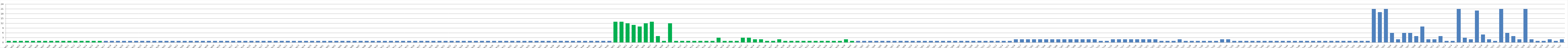
| Category | Series 0 |
|---|---|
| AW01 | 1 |
| AW02 | 1 |
| AW03 | 1 |
| AW04 | 1 |
| AW05 | 1 |
| AW06 | 1 |
| AW07 | 1 |
| AW08 | 1 |
| AW09 | 1 |
| AW10 | 1 |
| AW11 | 1 |
| AW12 | 1 |
| AW13 | 1 |
| AW14 | 1 |
| AW15 | 1 |
| AW16 | 1 |
| AW17 | 1 |
| AW18 | 1 |
| AW19 | 1 |
| AW20 | 1 |
| AW21 | 1 |
| AW22 | 1 |
| AW23 | 1 |
| AW24 | 1 |
| AW25 | 1 |
| AW26 | 1 |
| BW01 | 1 |
| BW02 | 1 |
| BW03 | 1 |
| BWO4 | 1 |
| BW05 | 1 |
| BW06 | 1 |
| BW07 | 1 |
| BW08 | 1 |
| BW09 | 1 |
| BW10 | 1 |
| BW11 | 1 |
| BW12 | 1 |
| BW13 | 1 |
| BW14 | 1 |
| BW15 | 1 |
| BW16 | 1 |
| BW17 | 1 |
| BW18 | 1 |
| BW19 | 1 |
| BW20 | 1 |
| BW21 | 1 |
| BW22 | 1 |
| BW23 | 1 |
| BW24 | 1 |
| BW25 | 1 |
| BW26 | 1 |
| CW01 | 1 |
| CW02 | 1 |
| CW03 | 1 |
| CW04 | 1 |
| CW05 | 1 |
| CW06 | 1 |
| CW07 | 1 |
| CW08 | 1 |
| CW09 | 1 |
| CW10 | 1 |
| CW11 | 1 |
| CW12 | 1 |
| CW13 | 1 |
| CW14 | 1 |
| CW15 | 1 |
| CW16 | 1 |
| CW17 | 1 |
| CW18 | 1 |
| CW19 | 1 |
| CW20 | 1 |
| CW21 | 1 |
| CW22 | 1 |
| CW23 | 1 |
| CW24 | 1 |
| CW25 | 1 |
| CW26 | 1 |
| CW27 | 1 |
| CW28 | 1 |
| CW29 | 1 |
| CW30 | 1 |
| CW31 | 1 |
| CW32 | 1 |
| CW33 | 1 |
| CW34 | 1 |
| CW35 | 1 |
| CW36 | 1 |
| CW37 | 1 |
| CW38 | 1 |
| CW39 | 1 |
| CW40 | 1 |
| CW41 | 1 |
| CW42 | 1 |
| CW43 | 1 |
| CW44 | 1 |
| CW45 | 1 |
| CW46 | 1 |
| CW47 | 1 |
| CW48 | 1 |
| DW01 | 13 |
| DW02 | 13 |
| DW03 | 12 |
| DW04 | 11 |
| DW05 | 10 |
| DW06 | 12 |
| DW07 | 13 |
| DW08 | 4 |
| DW09 | 1 |
| DW10 | 12 |
| DW11 | 1 |
| DW12 | 1 |
| DW13 | 1 |
| DW14 | 1 |
| DW15 | 1 |
| DW16 | 1 |
| DW17 | 1 |
| DW18 | 3 |
| DW19 | 1 |
| DW20 | 1 |
| DW21 | 1 |
| DW22 | 3 |
| DW23 | 3 |
| DW24 | 2 |
| DW25 | 2 |
| DW26 | 1 |
| DW27 | 1 |
| DW28 | 2 |
| DW29 | 1 |
| DW30 | 1 |
| DW31 | 1 |
| DW32 | 1 |
| DW33 | 1 |
| DW34 | 1 |
| DW35 | 1 |
| DW36 | 1 |
| DW37 | 1 |
| DW38 | 1 |
| DW39 | 2 |
| DW40 | 1 |
| AU01 | 1 |
| AU02 | 1 |
| AU03 | 1 |
| AU04 | 1 |
| AU05 | 1 |
| AU06 | 1 |
| AU07 | 1 |
| AU08 | 1 |
| AU09 | 1 |
| AU10 | 1 |
| AU11 | 1 |
| BU01 | 1 |
| BU02 | 1 |
| BU03 | 1 |
| BU04 | 1 |
| BU05 | 1 |
| BU06 | 1 |
| BU07 | 1 |
| BU08 | 1 |
| BU09 | 1 |
| BU10 | 1 |
| BU11 | 1 |
| BU12 | 1 |
| BU13 | 1 |
| BU14 | 1 |
| BU15 | 1 |
| BU16 | 2 |
| BU17 | 2 |
| CU01 | 2 |
| CU02 | 2 |
| CU03 | 2 |
| CU04 | 2 |
| CU05 | 2 |
| CU06 | 2 |
| CU07 | 2 |
| CU08 | 2 |
| CU09 | 2 |
| CU10 | 2 |
| CU11 | 2 |
| CU12 | 2 |
| CU13 | 1 |
| CU14 | 1 |
| CU15 | 2 |
| CU16 | 2 |
| CU17 | 2 |
| CU18 | 2 |
| CU19 | 2 |
| CU20 | 2 |
| CU21 | 2 |
| CU22 | 2 |
| CU23 | 1 |
| CU24 | 1 |
| CU25 | 1 |
| CU26 | 2 |
| CU27 | 1 |
| CU28 | 1 |
| CU29 | 1 |
| CU30 | 1 |
| CU31 | 1 |
| CU32 | 1 |
| CU33 | 2 |
| CU34 | 2 |
| CU35 | 1 |
| CU36 | 1 |
| CU37 | 1 |
| CU38 | 1 |
| CU39 | 1 |
| CU40 | 1 |
| CU41 | 1 |
| CU42 | 1 |
| CU43 | 1 |
| CU44 | 1 |
| CU45 | 1 |
| CU46 | 1 |
| CU47 | 1 |
| CU48 | 1 |
| CU49 | 1 |
| CU50 | 1 |
| CU51 | 1 |
| CU52 | 1 |
| CU53 | 1 |
| CU54 | 1 |
| CU55 | 1 |
| CU56 | 1 |
| CU57 | 1 |
| DU01 | 21 |
| DU02 | 19 |
| DU03 | 21 |
| DU04 | 6 |
| DU05 | 2 |
| DU06 | 6 |
| DU07 | 6 |
| DU08 | 4 |
| DU09 | 10 |
| DU10 | 2 |
| DU11 | 2 |
| DU12 | 4 |
| DU13 | 1 |
| DU14 | 1 |
| DU15 | 21 |
| DU16 | 3 |
| DU17 | 2 |
| DU18 | 20 |
| DU19 | 5 |
| DU20 | 2 |
| DU21 | 1 |
| DU22 | 21 |
| DU23 | 6 |
| DU24 | 4 |
| DU25 | 2 |
| DU26 | 21 |
| DU27 | 2 |
| DU28 | 1 |
| DU29 | 1 |
| DU30 | 2 |
| DU31 | 1 |
| DU32 | 2 |